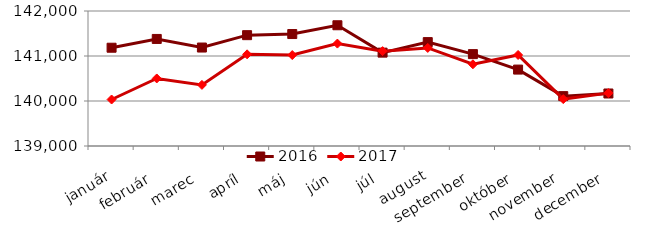
| Category | 2016 | 2017 |
|---|---|---|
| január | 141184 | 140033 |
| február | 141379 | 140501 |
| marec | 141188 | 140358 |
| apríl | 141463 | 141037 |
| máj | 141488 | 141021 |
| jún | 141683 | 141276 |
| júl | 141075 | 141108 |
| august | 141309 | 141179 |
| september | 141042 | 140816 |
| október | 140698 | 141023 |
| november | 140108 | 140042 |
| december | 140167 | 140175 |